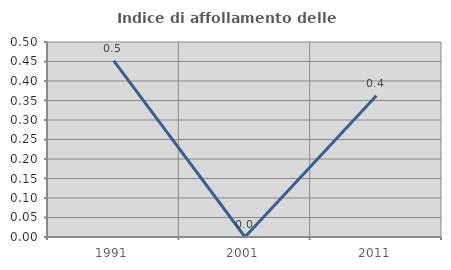
| Category | Indice di affollamento delle abitazioni  |
|---|---|
| 1991.0 | 0.452 |
| 2001.0 | 0 |
| 2011.0 | 0.362 |